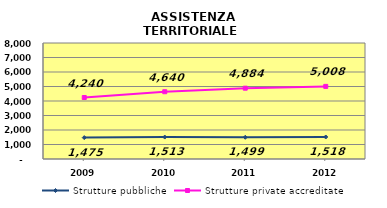
| Category | Strutture pubbliche | Strutture private accreditate |
|---|---|---|
| 2009.0 | 1475 | 4240 |
| 2010.0 | 1513 | 4640 |
| 2011.0 | 1499 | 4884 |
| 2012.0 | 1518 | 5008 |